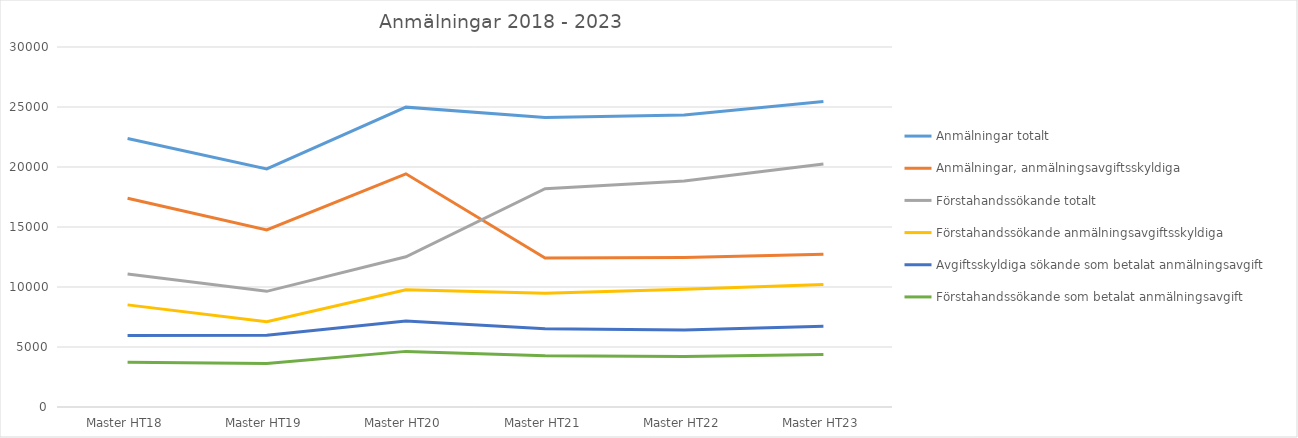
| Category | Anmälningar totalt | Anmälningar, anmälningsavgiftsskyldiga | Förstahandssökande totalt | Förstahandssökande anmälningsavgiftsskyldiga | Avgiftsskyldiga sökande som betalat anmälningsavgift | Förstahandssökande som betalat anmälningsavgift |
|---|---|---|---|---|---|---|
| Master HT18 | 22373 | 17395 | 11084 | 8511 | 5949 | 3719 |
| Master HT19 | 19841 | 14762 | 9639 | 7105 | 5974 | 3625 |
| Master HT20 | 24988 | 19430 | 12518 | 9766 | 7171 | 4635 |
| Master HT21 | 24133 | 12418 | 18187 | 9485 | 6528 | 4273 |
| Master HT22 | 24325 | 12458 | 18835 | 9803 | 6411 | 4202 |
| Master HT23 | 25465 | 12719 | 20249 | 10210 | 6727 | 4370 |